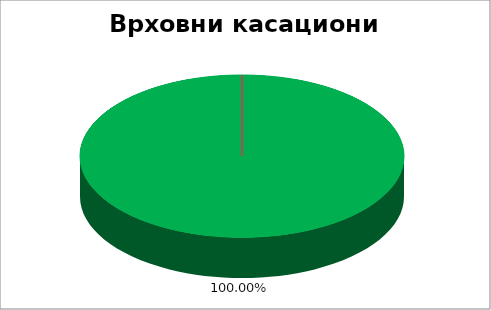
| Category | Врховни касациони суд  |
|---|---|
| 0 | 1 |
| 1 | 0 |
| 2 | 0 |
| 3 | 0 |
| 4 | 0 |